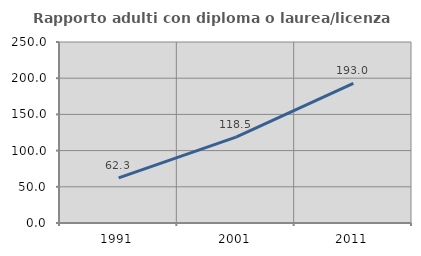
| Category | Rapporto adulti con diploma o laurea/licenza media  |
|---|---|
| 1991.0 | 62.313 |
| 2001.0 | 118.533 |
| 2011.0 | 192.972 |